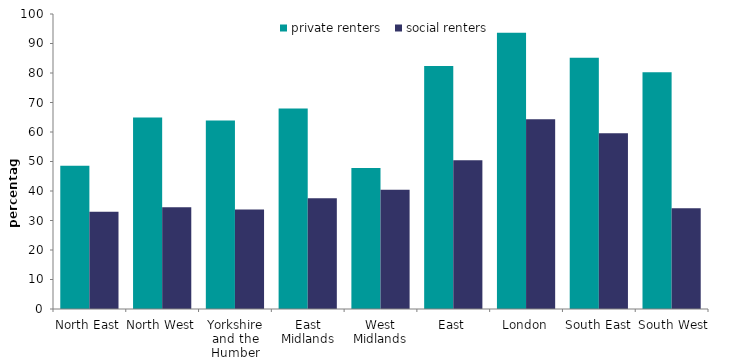
| Category | private renters | social renters |
|---|---|---|
| North East | 48.52 | 32.977 |
| North West | 64.947 | 34.529 |
| Yorkshire and the Humber | 63.931 | 33.75 |
| East Midlands | 68.006 | 37.537 |
| West Midlands | 47.801 | 40.42 |
| East | 82.384 | 50.41 |
| London | 93.661 | 64.338 |
| South East | 85.152 | 59.552 |
| South West | 80.263 | 34.169 |